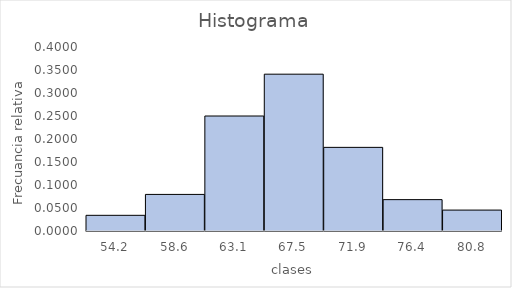
| Category | Series 0 |
|---|---|
| 54.214285714285715 | 0.034 |
| 58.642857142857146 | 0.08 |
| 63.07142857142858 | 0.25 |
| 67.5 | 0.341 |
| 71.92857142857144 | 0.182 |
| 76.35714285714286 | 0.068 |
| 80.7857142857143 | 0.045 |